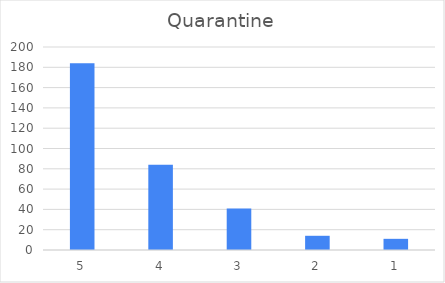
| Category | Series 0 |
|---|---|
| 5 | 184 |
| 4 | 84 |
| 3 | 41 |
| 2 | 14 |
| 1 | 11 |